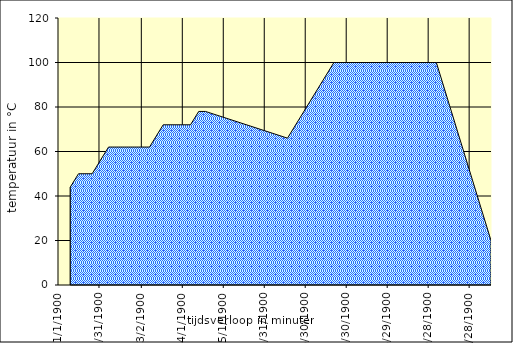
| Category | Maischschema grafisch |
|---|---|
| 0.0 | 44 |
| 10.0 | 44 |
| 16.0 | 50 |
| 26.0 | 50 |
| 38.0 | 62 |
| 68.0 | 62 |
| 78.0 | 72 |
| 98.0 | 72 |
| 104.0 | 78 |
| 109.0 | 78 |
| 109.0 | 78 |
| 169.0 | 66 |
| 203.0 | 100 |
| 278.0 | 100 |
| 278.0 | 100 |
| 318.0 | 20 |